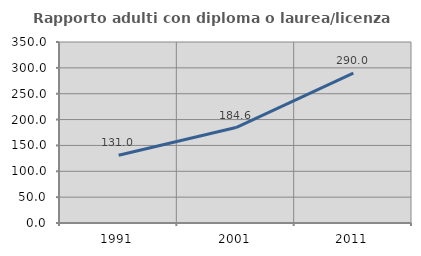
| Category | Rapporto adulti con diploma o laurea/licenza media  |
|---|---|
| 1991.0 | 131.034 |
| 2001.0 | 184.615 |
| 2011.0 | 290 |